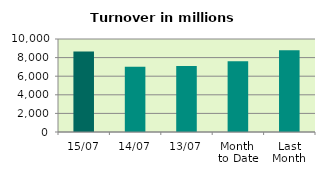
| Category | Series 0 |
|---|---|
| 15/07 | 8659.06 |
| 14/07 | 7024.523 |
| 13/07 | 7103.28 |
| Month 
to Date | 7596.824 |
| Last
Month | 8790.45 |